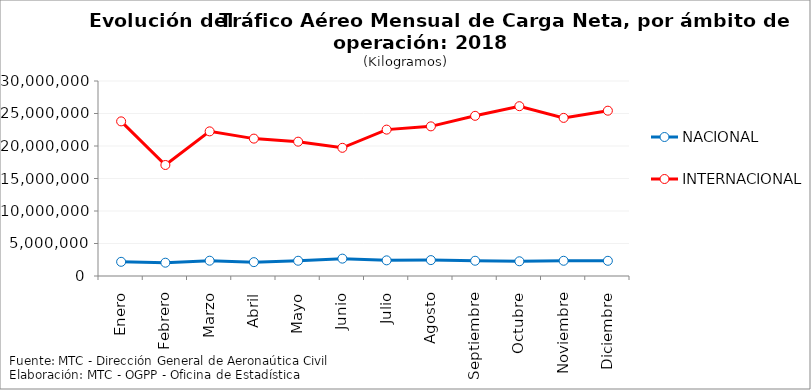
| Category | NACIONAL | INTERNACIONAL |
|---|---|---|
| Enero | 2181343.98 | 23788681 |
| Febrero | 2046665.37 | 17078749 |
| Marzo | 2355541.86 | 22250419 |
| Abril | 2133046.32 | 21136665 |
| Mayo | 2347560.58 | 20666283 |
| Junio | 2672309.89 | 19720877 |
| Julio | 2408360.6 | 22521412 |
| Agosto | 2446042.41 | 23020404 |
| Septiembre | 2347959.74 | 24642641 |
| Octubre | 2265207.15 | 26124170 |
| Noviembre | 2342849.09 | 24325060 |
| Diciembre | 2338605 | 25433396 |